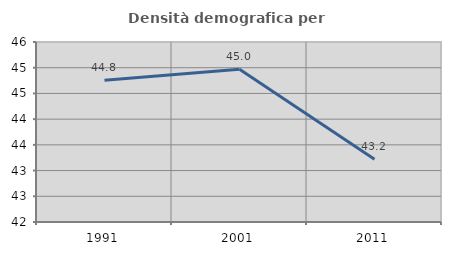
| Category | Densità demografica |
|---|---|
| 1991.0 | 44.755 |
| 2001.0 | 44.97 |
| 2011.0 | 43.222 |